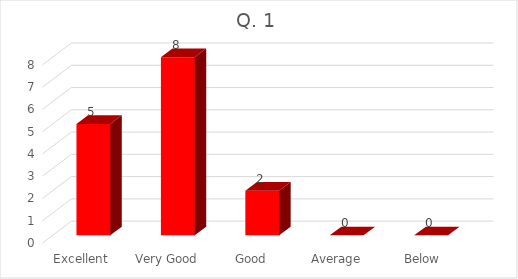
| Category | Series 0 |
|---|---|
| Excellent  | 5 |
| Very Good | 8 |
| Good | 2 |
| Average | 0 |
| Below Average | 0 |